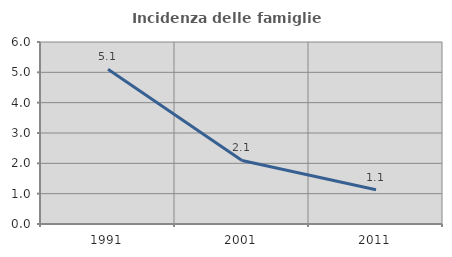
| Category | Incidenza delle famiglie numerose |
|---|---|
| 1991.0 | 5.103 |
| 2001.0 | 2.095 |
| 2011.0 | 1.127 |